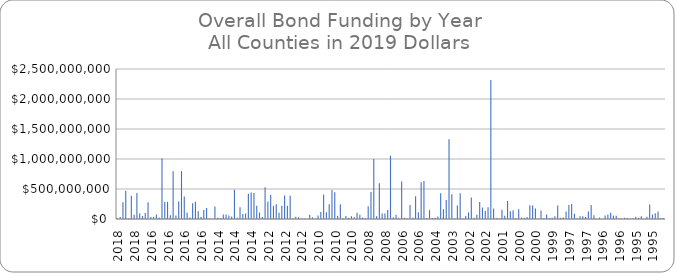
| Category | Funding 2019 |
|---|---|
| 2018.0 | 10812585 |
| 2018.0 | 34530908 |
| 2018.0 | 280515178 |
| 2018.0 | 469225389 |
| 2018.0 | 9792529 |
| 2018.0 | 389355068 |
| 2018.0 | 71403864 |
| 2018.0 | 433523458 |
| 2018.0 | 91804968 |
| 2018.0 | 51002759 |
| 2018.0 | 100985464.36 |
| 2016.0 | 278227219 |
| 2016.0 | 32016941 |
| 2016.0 | 35752250 |
| 2016.0 | 74706196 |
| 2016.0 | 26680784 |
| 2016.0 | 1013869803 |
| 2016.0 | 282817313 |
| 2016.0 | 287085239 |
| 2016.0 | 64033882 |
| 2016.0 | 794286949 |
| 2016.0 | 59764957 |
| 2016.0 | 293488627 |
| 2016.0 | 798289066 |
| 2016.0 | 373530980 |
| 2016.0 | 106723137.24 |
| 2016.0 | 26680754 |
| 2016.0 | 261471686 |
| 2016.0 | 288152470 |
| 2016.0 | 128067765 |
| 2016.0 | 35218635 |
| 2016.0 | 149412042 |
| 2016.0 | 181429333 |
| 2016.0 | 7470620 |
| 2016.0 | 4268925 |
| 2015.0 | 208574064 |
| 2014.0 | 21639548 |
| 2014.0 | 12983729 |
| 2014.0 | 73574463 |
| 2014.0 | 73574463 |
| 2014.0 | 58426779 |
| 2014.0 | 42197118 |
| 2014.0 | 486889826 |
| 2014.0 | 20557570 |
| 2014.0 | 194214941 |
| 2014.0 | 83312259 |
| 2014.0 | 91968078 |
| 2014.0 | 419807228 |
| 2014.0 | 443610731 |
| 2014.0 | 432790957 |
| 2012.0 | 220895641 |
| 2012.0 | 110447820 |
| 2012.0 | 33469037 |
| 2012.0 | 529926414 |
| 2012.0 | 290064984 |
| 2012.0 | 401628440 |
| 2012.0 | 217548738 |
| 2012.0 | 245439602 |
| 2012.0 | 105985283 |
| 2012.0 | 220895642 |
| 2012.0 | 390472094 |
| 2012.0 | 221174551 |
| 2012.0 | 388240825 |
| 2012.0 | 6693807 |
| 2012.0 | 39047209 |
| 2012.0 | 29006498 |
| 2012.0 | 10040711 |
| 2012.0 | 6693807 |
| 2012.0 | 4462538 |
| 2011.0 | 71739489 |
| 2011.0 | 29606773 |
| 2010.0 | 4892735 |
| 2010.0 | 58733307 |
| 2010.0 | 117466614 |
| 2010.0 | 409958483 |
| 2010.0 | 111593283 |
| 2010.0 | 246679889 |
| 2010.0 | 484314850 |
| 2010.0 | 446373133 |
| 2010.0 | 52859976 |
| 2010.0 | 246679889 |
| 2010.0 | 12451461 |
| 2010.0 | 49335978 |
| 2010.0 | 19969324 |
| 2010.0 | 46986645 |
| 2010.0 | 27985054 |
| 2009.0 | 105066184 |
| 2009.0 | 71397248 |
| 2009.0 | 23878678 |
| 2009.0 | 11091646 |
| 2008.0 | 212240011 |
| 2008.0 | 449701370 |
| 2008.0 | 999336377 |
| 2008.0 | 44018388 |
| 2008.0 | 594843081 |
| 2008.0 | 90416148 |
| 2008.0 | 90416148 |
| 2008.0 | 148710770 |
| 2008.0 | 1055727501 |
| 2008.0 | 30931840 |
| 2006.0 | 71150833 |
| 2006.0 | 19058259 |
| 2006.0 | 623586232 |
| 2006.0 | 19693534 |
| 2006.0 | 6352753 |
| 2006.0 | 232510759 |
| 2006.0 | 19058259 |
| 2006.0 | 378624077 |
| 2006.0 | 114349554 |
| 2005.0 | 613798894 |
| 2004.0 | 634594621 |
| 2004.0 | 16136060 |
| 2004.0 | 146444913 |
| 2004.0 | 17627628 |
| 2004.0 | 22373528 |
| 2004.0 | 40679142 |
| 2004.0 | 427130995 |
| 2004.0 | 162716570 |
| 2004.0 | 318653282 |
| 2004.0 | 1327851985 |
| 2003.0 | 410664049 |
| 2003.0 | 2088122 |
| 2002.0 | 223822566 |
| 2002.0 | 427142301 |
| 2002.0 | 7069205 |
| 2002.0 | 49833268 |
| 2002.0 | 109960666 |
| 2002.0 | 358372391 |
| 2002.0 | 20645211 |
| 2002.0 | 72614191 |
| 2002.0 | 282269871 |
| 2002.0 | 190505466 |
| 2002.0 | 135261729 |
| 2002.0 | 195773555 |
| 2002.0 | 2317958888 |
| 2001.0 | 175103407 |
| 2001.0 | 15339637 |
| 2001.0 | 4630834 |
| 2001.0 | 154843508 |
| 2001.0 | 54991153 |
| 2001.0 | 299557068 |
| 2001.0 | 127347932 |
| 2001.0 | 144713559 |
| 2000.0 | 14502870 |
| 2000.0 | 163622125 |
| 2000.0 | 22312108 |
| 2000.0 | 22312108 |
| 2000.0 | 32278183 |
| 2000.0 | 227880997 |
| 2000.0 | 223121080 |
| 2000.0 | 173290706 |
| 1999.0 | 3228693 |
| 1999.0 | 141447515 |
| 1999.0 | 10500941 |
| 1999.0 | 73798703 |
| 1999.0 | 15374730 |
| 1999.0 | 19987149 |
| 1998.0 | 47142883 |
| 1998.0 | 226285840 |
| 1998.0 | 18857153 |
| 1998.0 | 26714301 |
| 1998.0 | 124142926 |
| 1997.0 | 234598261 |
| 1997.0 | 250557327 |
| 1997.0 | 85939567 |
| 1997.0 | 9575739 |
| 1997.0 | 47877196 |
| 1997.0 | 47877196 |
| 1997.0 | 35109944 |
| 1997.0 | 126076617 |
| 1997.0 | 231406449 |
| 1997.0 | 63836262 |
| 1997.0 | 2952427 |
| 1996.0 | 24487859 |
| 1996.0 | 979514 |
| 1996.0 | 57138337 |
| 1996.0 | 73463576 |
| 1996.0 | 105624296 |
| 1996.0 | 55505813 |
| 1996.0 | 55505813 |
| 1996.0 | 10448153 |
| 1996.0 | 6856600 |
| 1995.0 | 21849469 |
| 1995.0 | 18151866 |
| 1995.0 | 3655584 |
| 1995.0 | 13563478 |
| 1995.0 | 38656752 |
| 1995.0 | 20168740 |
| 1995.0 | 45883884 |
| 1995.0 | 4369894 |
| 1995.0 | 36976024 |
| 1995.0 | 240344153 |
| 1995.0 | 74120120 |
| 1995.0 | 97482244 |
| 1995.0 | 126054626 |
| 1995.0 | 17227466 |
| 1995.0 | 17227466 |